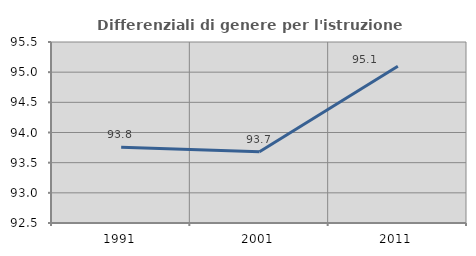
| Category | Differenziali di genere per l'istruzione superiore |
|---|---|
| 1991.0 | 93.756 |
| 2001.0 | 93.682 |
| 2011.0 | 95.097 |